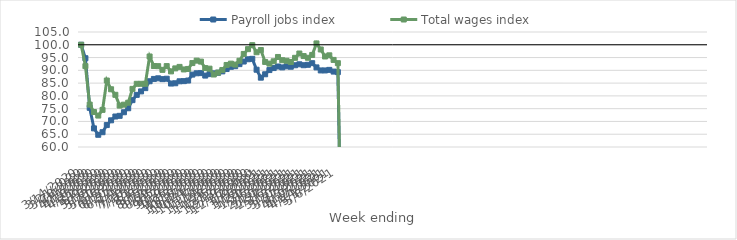
| Category | Payroll jobs index | Total wages index |
|---|---|---|
| 14/03/2020 | 100 | 100 |
| 21/03/2020 | 94.737 | 91.645 |
| 28/03/2020 | 75.336 | 76.596 |
| 04/04/2020 | 67.29 | 73.691 |
| 11/04/2020 | 64.78 | 72.298 |
| 18/04/2020 | 65.784 | 74.525 |
| 25/04/2020 | 68.582 | 86.01 |
| 02/05/2020 | 70.443 | 82.587 |
| 09/05/2020 | 71.93 | 80.424 |
| 16/05/2020 | 72.195 | 76.199 |
| 23/05/2020 | 73.599 | 76.568 |
| 30/05/2020 | 75.159 | 77.325 |
| 06/06/2020 | 78.338 | 82.744 |
| 13/06/2020 | 80.404 | 84.731 |
| 20/06/2020 | 81.76 | 84.732 |
| 27/06/2020 | 83.036 | 84.732 |
| 04/07/2020 | 85.734 | 95.425 |
| 11/07/2020 | 86.637 | 91.696 |
| 18/07/2020 | 86.879 | 91.639 |
| 25/07/2020 | 86.558 | 90.19 |
| 01/08/2020 | 86.721 | 91.662 |
| 08/08/2020 | 84.826 | 89.59 |
| 15/08/2020 | 84.938 | 90.76 |
| 22/08/2020 | 85.712 | 91.342 |
| 29/08/2020 | 85.774 | 90.348 |
| 05/09/2020 | 86.006 | 90.546 |
| 12/09/2020 | 88.33 | 92.844 |
| 19/09/2020 | 88.849 | 93.789 |
| 26/09/2020 | 88.91 | 93.414 |
| 03/10/2020 | 87.942 | 90.877 |
| 10/10/2020 | 88.517 | 90.652 |
| 17/10/2020 | 88.822 | 88.357 |
| 24/10/2020 | 89.047 | 89.118 |
| 31/10/2020 | 89.593 | 90.14 |
| 07/11/2020 | 90.509 | 92.099 |
| 14/11/2020 | 91.376 | 92.621 |
| 21/11/2020 | 91.623 | 92.252 |
| 28/11/2020 | 92.425 | 93.753 |
| 05/12/2020 | 93.444 | 96.413 |
| 12/12/2020 | 94.336 | 98.291 |
| 19/12/2020 | 94.5 | 99.846 |
| 26/12/2020 | 90.241 | 97.087 |
| 02/01/2021 | 87.129 | 97.943 |
| 09/01/2021 | 88.457 | 93.286 |
| 16/01/2021 | 90.105 | 92.625 |
| 23/01/2021 | 90.889 | 93.54 |
| 30/01/2021 | 91.501 | 95.229 |
| 06/02/2021 | 91.147 | 93.963 |
| 13/02/2021 | 91.566 | 93.756 |
| 20/02/2021 | 91.405 | 93.266 |
| 27/02/2021 | 91.989 | 94.896 |
| 06/03/2021 | 92.363 | 96.585 |
| 13/03/2021 | 92.002 | 95.589 |
| 20/03/2021 | 92.164 | 94.924 |
| 27/03/2021 | 92.801 | 96.03 |
| 03/04/2021 | 91.146 | 100.526 |
| 10/04/2021 | 89.959 | 98.163 |
| 17/04/2021 | 89.955 | 95.423 |
| 24/04/2021 | 90.179 | 95.872 |
| 01/05/2021 | 89.511 | 94.076 |
| 08/05/2021 | 89.298 | 92.804 |